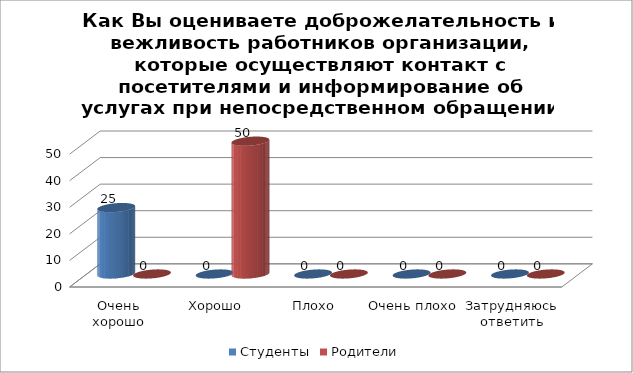
| Category | Студенты | Родители |
|---|---|---|
| Очень хорошо | 25 | 0 |
| Хорошо | 0 | 50 |
| Плохо | 0 | 0 |
| Очень плохо | 0 | 0 |
| Затрудняюсь ответить | 0 | 0 |